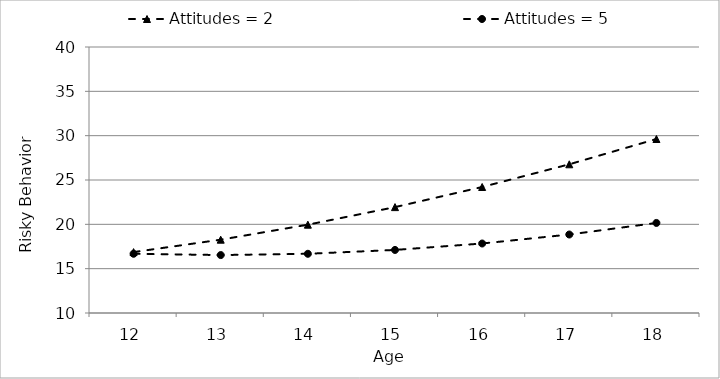
| Category | Attitudes = 2 | Attitudes = 5 |
|---|---|---|
| 12.0 | 16.869 | 16.679 |
| 13.0 | 18.27 | 16.534 |
| 14.0 | 19.96 | 16.678 |
| 15.0 | 21.941 | 17.113 |
| 16.0 | 24.212 | 17.838 |
| 17.0 | 26.772 | 18.852 |
| 18.0 | 29.623 | 20.156 |